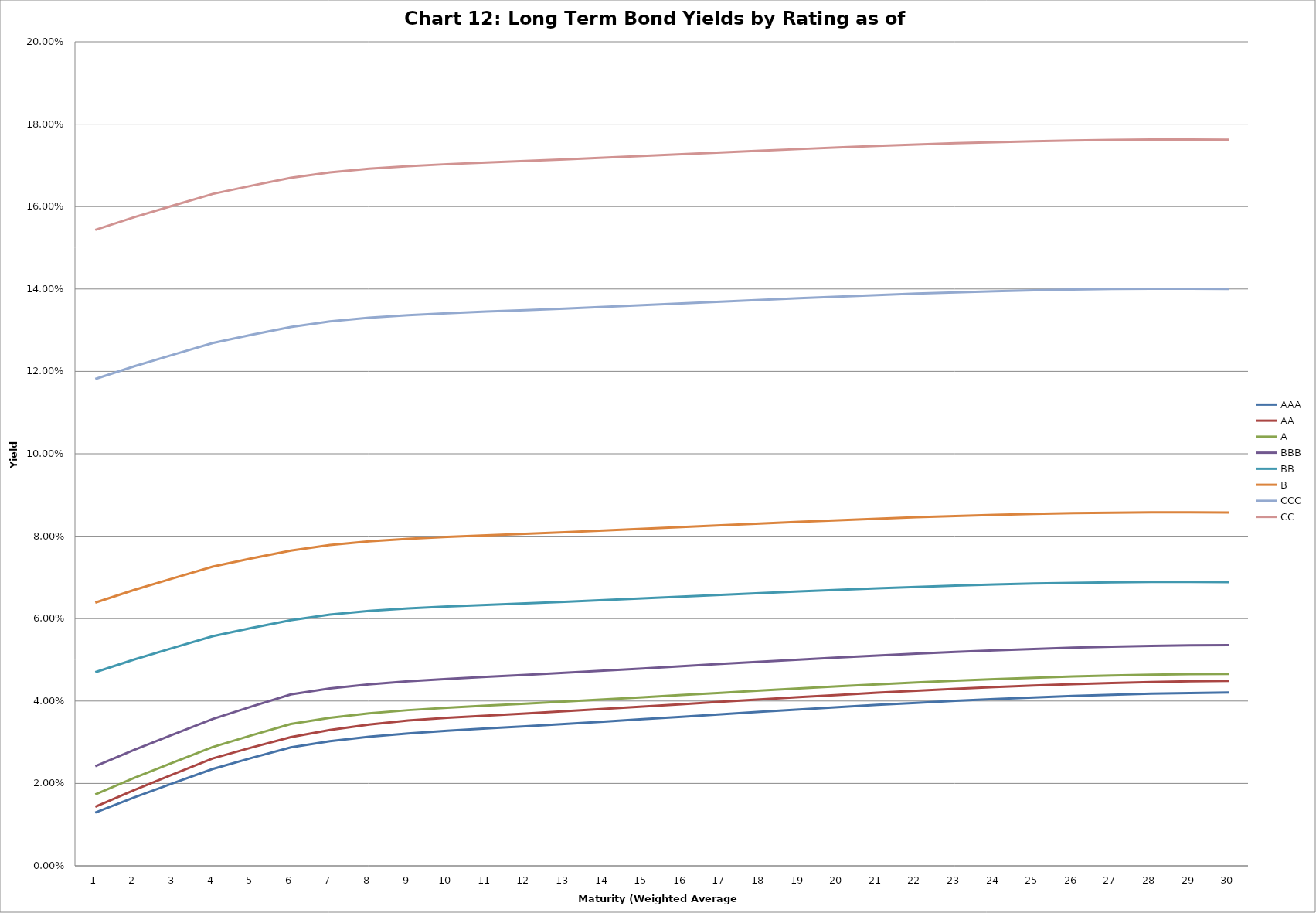
| Category | AAA | AA | A | BBB | BB | B | CCC | CC |
|---|---|---|---|---|---|---|---|---|
| 0 | 0.013 | 0.014 | 0.017 | 0.024 | 0.047 | 0.064 | 0.118 | 0.154 |
| 1 | 0.017 | 0.018 | 0.021 | 0.028 | 0.05 | 0.067 | 0.121 | 0.157 |
| 2 | 0.02 | 0.022 | 0.025 | 0.032 | 0.053 | 0.07 | 0.124 | 0.16 |
| 3 | 0.023 | 0.026 | 0.029 | 0.036 | 0.056 | 0.073 | 0.127 | 0.163 |
| 4 | 0.026 | 0.029 | 0.032 | 0.039 | 0.058 | 0.075 | 0.129 | 0.165 |
| 5 | 0.029 | 0.031 | 0.034 | 0.042 | 0.06 | 0.077 | 0.131 | 0.167 |
| 6 | 0.03 | 0.033 | 0.036 | 0.043 | 0.061 | 0.078 | 0.132 | 0.168 |
| 7 | 0.031 | 0.034 | 0.037 | 0.044 | 0.062 | 0.079 | 0.133 | 0.169 |
| 8 | 0.032 | 0.035 | 0.038 | 0.045 | 0.062 | 0.079 | 0.134 | 0.17 |
| 9 | 0.033 | 0.036 | 0.038 | 0.045 | 0.063 | 0.08 | 0.134 | 0.17 |
| 10 | 0.033 | 0.036 | 0.039 | 0.046 | 0.063 | 0.08 | 0.134 | 0.171 |
| 11 | 0.034 | 0.037 | 0.039 | 0.046 | 0.064 | 0.081 | 0.135 | 0.171 |
| 12 | 0.034 | 0.038 | 0.04 | 0.047 | 0.064 | 0.081 | 0.135 | 0.171 |
| 13 | 0.035 | 0.038 | 0.04 | 0.047 | 0.064 | 0.081 | 0.136 | 0.172 |
| 14 | 0.036 | 0.039 | 0.041 | 0.048 | 0.065 | 0.082 | 0.136 | 0.172 |
| 15 | 0.036 | 0.039 | 0.041 | 0.048 | 0.065 | 0.082 | 0.137 | 0.173 |
| 16 | 0.037 | 0.04 | 0.042 | 0.049 | 0.066 | 0.083 | 0.137 | 0.173 |
| 17 | 0.037 | 0.04 | 0.043 | 0.05 | 0.066 | 0.083 | 0.137 | 0.174 |
| 18 | 0.038 | 0.041 | 0.043 | 0.05 | 0.067 | 0.083 | 0.138 | 0.174 |
| 19 | 0.039 | 0.041 | 0.044 | 0.051 | 0.067 | 0.084 | 0.138 | 0.174 |
| 20 | 0.039 | 0.042 | 0.044 | 0.051 | 0.067 | 0.084 | 0.139 | 0.175 |
| 21 | 0.04 | 0.043 | 0.045 | 0.051 | 0.068 | 0.085 | 0.139 | 0.175 |
| 22 | 0.04 | 0.043 | 0.045 | 0.052 | 0.068 | 0.085 | 0.139 | 0.175 |
| 23 | 0.04 | 0.043 | 0.045 | 0.052 | 0.068 | 0.085 | 0.139 | 0.176 |
| 24 | 0.041 | 0.044 | 0.046 | 0.053 | 0.069 | 0.085 | 0.14 | 0.176 |
| 25 | 0.041 | 0.044 | 0.046 | 0.053 | 0.069 | 0.086 | 0.14 | 0.176 |
| 26 | 0.042 | 0.044 | 0.046 | 0.053 | 0.069 | 0.086 | 0.14 | 0.176 |
| 27 | 0.042 | 0.045 | 0.046 | 0.053 | 0.069 | 0.086 | 0.14 | 0.176 |
| 28 | 0.042 | 0.045 | 0.047 | 0.054 | 0.069 | 0.086 | 0.14 | 0.176 |
| 29 | 0.042 | 0.045 | 0.047 | 0.054 | 0.069 | 0.086 | 0.14 | 0.176 |